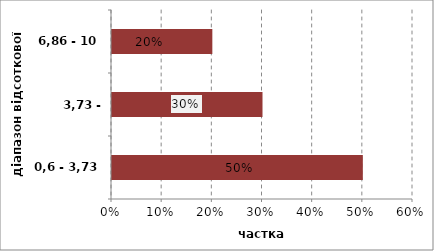
| Category | Series 0 |
|---|---|
| 0,6 - 3,73 | 0.5 |
| 3,73 - 6,86 | 0.3 |
| 6,86 - 10 | 0.2 |